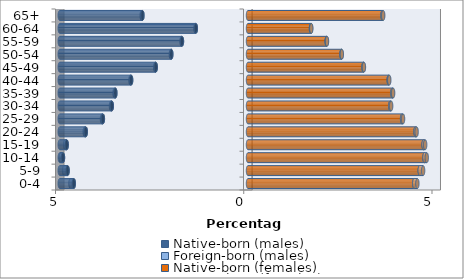
| Category | Native-born (males) | Foreign-born (males) | Native-born (females) | Foreign-born (females) |
|---|---|---|---|---|
| 0-4 | -4.627 | -0.089 | 4.415 | 0.083 |
| 5-9 | -4.792 | -0.093 | 4.562 | 0.09 |
| 10-14 | -4.915 | -0.062 | 4.687 | 0.061 |
| 15-19 | -4.816 | -0.04 | 4.664 | 0.042 |
| 20-24 | -4.309 | -0.027 | 4.449 | 0.03 |
| 25-29 | -3.855 | -0.023 | 4.093 | 0.025 |
| 30-34 | -3.617 | -0.022 | 3.779 | 0.023 |
| 35-39 | -3.523 | -0.021 | 3.835 | 0.019 |
| 40-44 | -3.105 | -0.017 | 3.737 | 0.015 |
| 45-49 | -2.45 | -0.014 | 3.067 | 0.012 |
| 50-54 | -2.037 | -0.011 | 2.482 | 0.009 |
| 55-59 | -1.755 | -0.01 | 2.09 | 0.008 |
| 60-64 | -1.385 | -0.009 | 1.673 | 0.008 |
| 65+ | -2.804 | -0.02 | 3.573 | 0.018 |